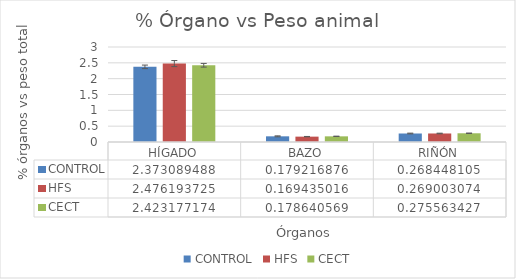
| Category | CONTROL | HFS | CECT |
|---|---|---|---|
| HÍGADO | 2.373 | 2.476 | 2.423 |
| BAZO | 0.179 | 0.169 | 0.179 |
| RIÑÓN | 0.268 | 0.269 | 0.276 |